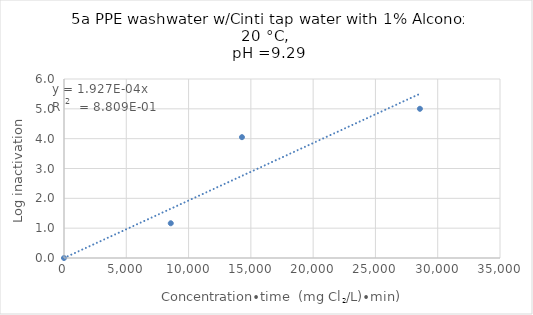
| Category | Series 0 |
|---|---|
| 0.0 | 0 |
| 8571.428571428572 | 1.165 |
| 14285.714285714286 | 4.05 |
| 28571.428571428572 | 5.001 |